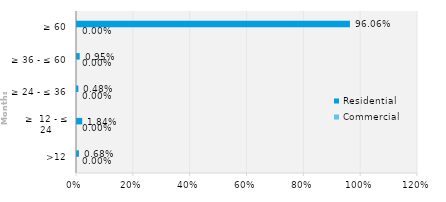
| Category | Commercial | Residential |
|---|---|---|
| >12 | 0 | 0.007 |
| ≥  12 - ≤ 24 | 0 | 0.018 |
| ≥ 24 - ≤ 36 | 0 | 0.005 |
| ≥ 36 - ≤ 60 | 0 | 0.01 |
| ≥ 60 | 0 | 0.961 |